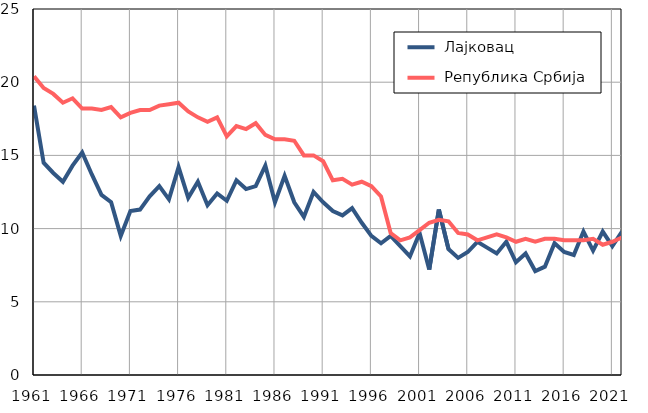
| Category |  Лајковац |  Република Србија |
|---|---|---|
| 1961.0 | 18.4 | 20.4 |
| 1962.0 | 14.5 | 19.6 |
| 1963.0 | 13.8 | 19.2 |
| 1964.0 | 13.2 | 18.6 |
| 1965.0 | 14.3 | 18.9 |
| 1966.0 | 15.2 | 18.2 |
| 1967.0 | 13.7 | 18.2 |
| 1968.0 | 12.3 | 18.1 |
| 1969.0 | 11.8 | 18.3 |
| 1970.0 | 9.5 | 17.6 |
| 1971.0 | 11.2 | 17.9 |
| 1972.0 | 11.3 | 18.1 |
| 1973.0 | 12.2 | 18.1 |
| 1974.0 | 12.9 | 18.4 |
| 1975.0 | 12 | 18.5 |
| 1976.0 | 14.2 | 18.6 |
| 1977.0 | 12.1 | 18 |
| 1978.0 | 13.2 | 17.6 |
| 1979.0 | 11.6 | 17.3 |
| 1980.0 | 12.4 | 17.6 |
| 1981.0 | 11.9 | 16.3 |
| 1982.0 | 13.3 | 17 |
| 1983.0 | 12.7 | 16.8 |
| 1984.0 | 12.9 | 17.2 |
| 1985.0 | 14.3 | 16.4 |
| 1986.0 | 11.8 | 16.1 |
| 1987.0 | 13.6 | 16.1 |
| 1988.0 | 11.8 | 16 |
| 1989.0 | 10.8 | 15 |
| 1990.0 | 12.5 | 15 |
| 1991.0 | 11.8 | 14.6 |
| 1992.0 | 11.2 | 13.3 |
| 1993.0 | 10.9 | 13.4 |
| 1994.0 | 11.4 | 13 |
| 1995.0 | 10.4 | 13.2 |
| 1996.0 | 9.5 | 12.9 |
| 1997.0 | 9 | 12.2 |
| 1998.0 | 9.5 | 9.7 |
| 1999.0 | 8.8 | 9.2 |
| 2000.0 | 8.1 | 9.4 |
| 2001.0 | 9.7 | 9.9 |
| 2002.0 | 7.2 | 10.4 |
| 2003.0 | 11.3 | 10.6 |
| 2004.0 | 8.6 | 10.5 |
| 2005.0 | 8 | 9.7 |
| 2006.0 | 8.4 | 9.6 |
| 2007.0 | 9.1 | 9.2 |
| 2008.0 | 8.7 | 9.4 |
| 2009.0 | 8.3 | 9.6 |
| 2010.0 | 9.1 | 9.4 |
| 2011.0 | 7.7 | 9.1 |
| 2012.0 | 8.3 | 9.3 |
| 2013.0 | 7.1 | 9.1 |
| 2014.0 | 7.4 | 9.3 |
| 2015.0 | 9 | 9.3 |
| 2016.0 | 8.4 | 9.2 |
| 2017.0 | 8.2 | 9.2 |
| 2018.0 | 9.8 | 9.2 |
| 2019.0 | 8.5 | 9.3 |
| 2020.0 | 9.8 | 8.9 |
| 2021.0 | 8.8 | 9.1 |
| 2022.0 | 9.8 | 9.4 |